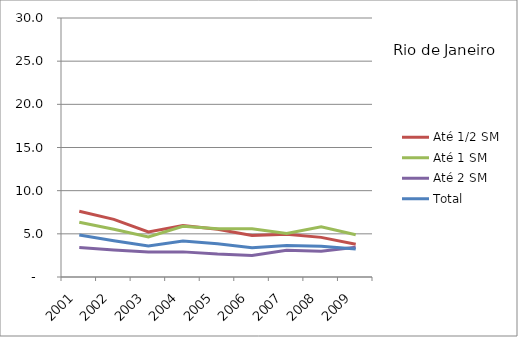
| Category | Até 1/2 SM | Até 1 SM | Até 2 SM | Total |
|---|---|---|---|---|
| 2001.0 | 7.62 | 6.35 | 3.41 | 4.87 |
| 2002.0 | 6.68 | 5.54 | 3.13 | 4.21 |
| 2003.0 | 5.21 | 4.65 | 2.89 | 3.6 |
| 2004.0 | 5.97 | 5.87 | 2.91 | 4.16 |
| 2005.0 | 5.53 | 5.59 | 2.65 | 3.86 |
| 2006.0 | 4.8 | 5.59 | 2.48 | 3.38 |
| 2007.0 | 4.94 | 5.04 | 3.11 | 3.65 |
| 2008.0 | 4.59 | 5.83 | 2.98 | 3.56 |
| 2009.0 | 3.79 | 4.9 | 3.44 | 3.23 |